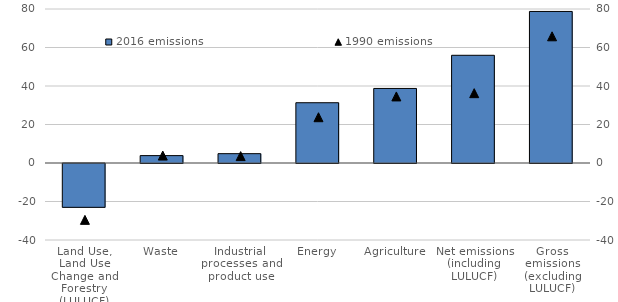
| Category | 2016 emissions |
|---|---|
| Land Use, Land Use Change and Forestry (LULUCF) | -22.774 |
| Waste | 3.838 |
| Industrial processes and product use | 4.853 |
| Energy | 31.308 |
| Agriculture | 38.727 |
| Net emissions (including LULUCF) | 55.953 |
| Gross emissions (excluding LULUCF) | 78.727 |